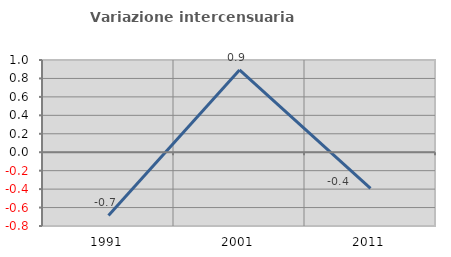
| Category | Variazione intercensuaria annua |
|---|---|
| 1991.0 | -0.685 |
| 2001.0 | 0.892 |
| 2011.0 | -0.393 |